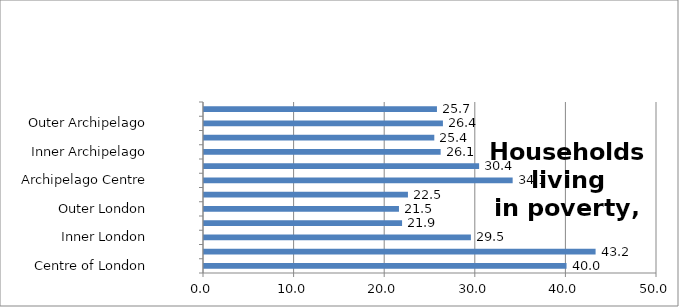
| Category | Series 0 |
|---|---|
| Centre of London | 40.015 |
| London Core | 43.222 |
| Inner London | 29.458 |
| London Suburbs | 21.862 |
| Outer London | 21.519 |
| London Edge | 22.511 |
| Archipelago Centre | 34.068 |
| Archipelago Core | 30.366 |
| Inner Archipelago | 26.12 |
| Archipelago Suburbs | 25.419 |
| Outer Archipelago | 26.372 |
| Archipelago Edge | 25.712 |